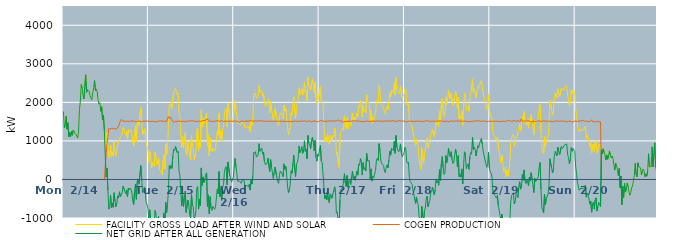
| Category | FACILITY GROSS LOAD AFTER WIND AND SOLAR | COGEN PRODUCTION | NET GRID AFTER ALL GENERATION |
|---|---|---|---|
|  Mon  2/14 | 1763 | 0 | 1763 |
|  Mon  2/14 | 1338 | 0 | 1338 |
|  Mon  2/14 | 1406 | 0 | 1406 |
|  Mon  2/14 | 1637 | 0 | 1637 |
|  Mon  2/14 | 1302 | 0 | 1302 |
|  Mon  2/14 | 1474 | 0 | 1474 |
|  Mon  2/14 | 1107 | 0 | 1107 |
|  Mon  2/14 | 1228 | 0 | 1228 |
|  Mon  2/14 | 1108 | 0 | 1108 |
|  Mon  2/14 | 1243 | 0 | 1243 |
|  Mon  2/14 | 1146 | 0 | 1146 |
|  Mon  2/14 | 1281 | 0 | 1281 |
|  Mon  2/14 | 1255 | 0 | 1255 |
|  Mon  2/14 | 1197 | 0 | 1197 |
|  Mon  2/14 | 1165 | 0 | 1165 |
|  Mon  2/14 | 1125 | 0 | 1125 |
|  Mon  2/14 | 1075 | 0 | 1075 |
|  Mon  2/14 | 1249 | 0 | 1249 |
|  Mon  2/14 | 1811 | 0 | 1811 |
|  Mon  2/14 | 2023 | 0 | 2023 |
|  Mon  2/14 | 2462 | 0 | 2462 |
|  Mon  2/14 | 2377 | 0 | 2377 |
|  Mon  2/14 | 2184 | 0 | 2184 |
|  Mon  2/14 | 2088 | 0 | 2088 |
|  Mon  2/14 | 2095 | 0 | 2095 |
|  Mon  2/14 | 2714 | 0 | 2714 |
|  Mon  2/14 | 2259 | 0 | 2259 |
|  Mon  2/14 | 2332 | 0 | 2332 |
|  Mon  2/14 | 2338 | 0 | 2338 |
|  Mon  2/14 | 2280 | 0 | 2280 |
|  Mon  2/14 | 2171 | 0 | 2171 |
|  Mon  2/14 | 2099 | 0 | 2099 |
|  Mon  2/14 | 2066 | 0 | 2066 |
|  Mon  2/14 | 2262 | 0 | 2262 |
|  Mon  2/14 | 2381 | 0 | 2381 |
|  Mon  2/14 | 2566 | 0 | 2566 |
|  Mon  2/14 | 2305 | 0 | 2305 |
|  Mon  2/14 | 2348 | 0 | 2348 |
|  Mon  2/14 | 2267 | 0 | 2267 |
|  Mon  2/14 | 2052 | 0 | 2052 |
|  Mon  2/14 | 1951 | 0 | 1951 |
|  Mon  2/14 | 1992 | 0 | 1992 |
|  Mon  2/14 | 1769 | 0 | 1769 |
|  Mon  2/14 | 1887 | 0 | 1887 |
|  Mon  2/14 | 1541 | 0 | 1541 |
|  Mon  2/14 | 1666 | 0 | 1666 |
|  Mon  2/14 | 1268 | 0 | 1268 |
|  Mon  2/14 | 1276 | 0 | 1276 |
|  Mon  2/14 | 760 | 699 | 61 |
|  Mon  2/14 | 1222 | 924 | 298 |
|  Mon  2/14 | 830 | 1115 | -285 |
|  Mon  2/14 | 562 | 1330 | -768 |
|  Mon  2/14 | 590 | 1304 | -714 |
|  Mon  2/14 | 893 | 1303 | -410 |
|  Mon  2/14 | 589 | 1323 | -734 |
|  Mon  2/14 | 719 | 1329 | -610 |
|  Mon  2/14 | 599 | 1322 | -723 |
|  Mon  2/14 | 973 | 1318 | -345 |
|  Mon  2/14 | 742 | 1306 | -564 |
|  Mon  2/14 | 605 | 1312 | -707 |
|  Mon  2/14 | 693 | 1317 | -624 |
|  Mon  2/14 | 886 | 1311 | -425 |
|  Mon  2/14 | 901 | 1383 | -482 |
|  Mon  2/14 | 1050 | 1369 | -319 |
|  Mon  2/14 | 1058 | 1511 | -453 |
|  Mon  2/14 | 1131 | 1562 | -431 |
|  Mon  2/14 | 1179 | 1530 | -351 |
|  Mon  2/14 | 1350 | 1523 | -173 |
|  Mon  2/14 | 1318 | 1508 | -190 |
|  Mon  2/14 | 1205 | 1507 | -302 |
|  Mon  2/14 | 1144 | 1511 | -367 |
|  Mon  2/14 | 1241 | 1514 | -273 |
|  Mon  2/14 | 1062 | 1509 | -447 |
|  Mon  2/14 | 1291 | 1515 | -224 |
|  Mon  2/14 | 1236 | 1505 | -269 |
|  Mon  2/14 | 1295 | 1515 | -220 |
|  Mon  2/14 | 1266 | 1516 | -250 |
|  Mon  2/14 | 1169 | 1522 | -353 |
|  Mon  2/14 | 951 | 1521 | -570 |
|  Mon  2/14 | 870 | 1520 | -650 |
|  Mon  2/14 | 1213 | 1506 | -293 |
|  Mon  2/14 | 1394 | 1511 | -117 |
|  Mon  2/14 | 983 | 1498 | -515 |
|  Mon  2/14 | 1468 | 1512 | -44 |
|  Mon  2/14 | 1535 | 1519 | 16 |
|  Mon  2/14 | 1390 | 1515 | -125 |
|  Mon  2/14 | 1399 | 1504 | -105 |
|  Mon  2/14 | 1867 | 1509 | 358 |
|  Mon  2/14 | 1522 | 1506 | 16 |
|  Mon  2/14 | 1164 | 1512 | -348 |
|  Mon  2/14 | 1219 | 1512 | -293 |
|  Mon  2/14 | 1312 | 1507 | -195 |
|  Mon  2/14 | 1182 | 1512 | -330 |
|  Mon  2/14 | 930 | 1502 | -572 |
|  Mon  2/14 | 922 | 1518 | -596 |
|  Mon  2/14 | 775 | 1513 | -738 |
|  Tue  2/15 | 442 | 1506 | -1064 |
|  Tue  2/15 | 728 | 1514 | -786 |
|  Tue  2/15 | 695 | 1506 | -811 |
|  Tue  2/15 | 291 | 1521 | -1230 |
|  Tue  2/15 | 448 | 1508 | -1060 |
|  Tue  2/15 | 394 | 1524 | -1130 |
|  Tue  2/15 | 332 | 1505 | -1173 |
|  Tue  2/15 | 697 | 1504 | -807 |
|  Tue  2/15 | 578 | 1490 | -912 |
|  Tue  2/15 | 375 | 1509 | -1134 |
|  Tue  2/15 | 367 | 1509 | -1142 |
|  Tue  2/15 | 549 | 1511 | -962 |
|  Tue  2/15 | 268 | 1518 | -1250 |
|  Tue  2/15 | 214 | 1509 | -1295 |
|  Tue  2/15 | 184 | 1519 | -1335 |
|  Tue  2/15 | 125 | 1517 | -1392 |
|  Tue  2/15 | 459 | 1509 | -1050 |
|  Tue  2/15 | 639 | 1507 | -868 |
|  Tue  2/15 | 269 | 1506 | -1237 |
|  Tue  2/15 | 928 | 1519 | -591 |
|  Tue  2/15 | 637 | 1505 | -868 |
|  Tue  2/15 | 857 | 1507 | -650 |
|  Tue  2/15 | 1317 | 1635 | -318 |
|  Tue  2/15 | 1940 | 1583 | 357 |
|  Tue  2/15 | 1901 | 1621 | 280 |
|  Tue  2/15 | 1958 | 1593 | 365 |
|  Tue  2/15 | 1837 | 1549 | 288 |
|  Tue  2/15 | 2127 | 1516 | 611 |
|  Tue  2/15 | 2269 | 1485 | 784 |
|  Tue  2/15 | 2257 | 1504 | 753 |
|  Tue  2/15 | 2364 | 1508 | 856 |
|  Tue  2/15 | 2368 | 1512 | 856 |
|  Tue  2/15 | 2199 | 1502 | 697 |
|  Tue  2/15 | 2239 | 1512 | 727 |
|  Tue  2/15 | 1739 | 1524 | 215 |
|  Tue  2/15 | 1624 | 1517 | 107 |
|  Tue  2/15 | 1165 | 1502 | -337 |
|  Tue  2/15 | 829 | 1513 | -684 |
|  Tue  2/15 | 1118 | 1513 | -395 |
|  Tue  2/15 | 824 | 1529 | -705 |
|  Tue  2/15 | 1033 | 1499 | -466 |
|  Tue  2/15 | 1214 | 1517 | -303 |
|  Tue  2/15 | 657 | 1513 | -856 |
|  Tue  2/15 | 625 | 1505 | -880 |
|  Tue  2/15 | 971 | 1508 | -537 |
|  Tue  2/15 | 854 | 1502 | -648 |
|  Tue  2/15 | 587 | 1515 | -928 |
|  Tue  2/15 | 504 | 1505 | -1001 |
|  Tue  2/15 | 1133 | 1525 | -392 |
|  Tue  2/15 | 859 | 1526 | -667 |
|  Tue  2/15 | 803 | 1520 | -717 |
|  Tue  2/15 | 513 | 1519 | -1006 |
|  Tue  2/15 | 538 | 1508 | -970 |
|  Tue  2/15 | 696 | 1510 | -814 |
|  Tue  2/15 | 1278 | 1501 | -223 |
|  Tue  2/15 | 1329 | 1511 | -182 |
|  Tue  2/15 | 749 | 1517 | -768 |
|  Tue  2/15 | 1004 | 1511 | -507 |
|  Tue  2/15 | 821 | 1503 | -682 |
|  Tue  2/15 | 1811 | 1512 | 299 |
|  Tue  2/15 | 1361 | 1518 | -157 |
|  Tue  2/15 | 1579 | 1513 | 66 |
|  Tue  2/15 | 1447 | 1527 | -80 |
|  Tue  2/15 | 1539 | 1528 | 11 |
|  Tue  2/15 | 1661 | 1538 | 123 |
|  Tue  2/15 | 1724 | 1554 | 170 |
|  Tue  2/15 | 871 | 1573 | -702 |
|  Tue  2/15 | 1167 | 1566 | -399 |
|  Tue  2/15 | 610 | 1505 | -895 |
|  Tue  2/15 | 1081 | 1528 | -447 |
|  Tue  2/15 | 756 | 1508 | -752 |
|  Tue  2/15 | 713 | 1517 | -804 |
|  Tue  2/15 | 812 | 1508 | -696 |
|  Tue  2/15 | 766 | 1505 | -739 |
|  Tue  2/15 | 731 | 1507 | -776 |
|  Tue  2/15 | 795 | 1514 | -719 |
|  Tue  2/15 | 792 | 1526 | -734 |
|  Tue  2/15 | 1253 | 1506 | -253 |
|  Tue  2/15 | 1149 | 1520 | -371 |
|  Tue  2/15 | 1713 | 1511 | 202 |
|  Tue  2/15 | 1055 | 1503 | -448 |
|  Tue  2/15 | 1262 | 1502 | -240 |
|  Tue  2/15 | 987 | 1529 | -542 |
|  Tue  2/15 | 1306 | 1505 | -199 |
|  Tue  2/15 | 1366 | 1504 | -138 |
|  Tue  2/15 | 1690 | 1508 | 182 |
|  Tue  2/15 | 1818 | 1515 | 303 |
|  Tue  2/15 | 1847 | 1514 | 333 |
|  Tue  2/15 | 1370 | 1512 | -142 |
|  Tue  2/15 | 1976 | 1522 | 454 |
|  Tue  2/15 | 1962 | 1504 | 458 |
|  Tue  2/15 | 1605 | 1509 | 96 |
|  Tue  2/15 | 1561 | 1518 | 43 |
|  Tue  2/15 | 1447 | 1518 | -71 |
|  Tue  2/15 | 1422 | 1504 | -82 |
|  Tue  2/15 | 1568 | 1509 | 59 |
|  Wed  2/16 | 1572 | 1519 | 53 |
|  Wed  2/16 | 2056 | 1511 | 545 |
|  Wed  2/16 | 1830 | 1507 | 323 |
|  Wed  2/16 | 1665 | 1509 | 156 |
|  Wed  2/16 | 1462 | 1508 | -46 |
|  Wed  2/16 | 1466 | 1512 | -46 |
|  Wed  2/16 | 1438 | 1478 | -40 |
|  Wed  2/16 | 1456 | 1506 | -50 |
|  Wed  2/16 | 1420 | 1521 | -101 |
|  Wed  2/16 | 1498 | 1512 | -14 |
|  Wed  2/16 | 1513 | 1503 | 10 |
|  Wed  2/16 | 1504 | 1503 | 1 |
|  Wed  2/16 | 1327 | 1521 | -194 |
|  Wed  2/16 | 1314 | 1504 | -190 |
|  Wed  2/16 | 1386 | 1539 | -153 |
|  Wed  2/16 | 1356 | 1503 | -147 |
|  Wed  2/16 | 1323 | 1515 | -192 |
|  Wed  2/16 | 1390 | 1515 | -125 |
|  Wed  2/16 | 1230 | 1506 | -276 |
|  Wed  2/16 | 1518 | 1524 | -6 |
|  Wed  2/16 | 1398 | 1518 | -120 |
|  Wed  2/16 | 1612 | 1511 | 101 |
|  Wed  2/16 | 2213 | 1511 | 702 |
|  Wed  2/16 | 2190 | 1517 | 673 |
|  Wed  2/16 | 2235 | 1514 | 721 |
|  Wed  2/16 | 2098 | 1519 | 579 |
|  Wed  2/16 | 2121 | 1527 | 594 |
|  Wed  2/16 | 2141 | 1512 | 629 |
|  Wed  2/16 | 2443 | 1516 | 927 |
|  Wed  2/16 | 2260 | 1530 | 730 |
|  Wed  2/16 | 2280 | 1508 | 772 |
|  Wed  2/16 | 2326 | 1509 | 817 |
|  Wed  2/16 | 2163 | 1511 | 652 |
|  Wed  2/16 | 2221 | 1515 | 706 |
|  Wed  2/16 | 1985 | 1520 | 465 |
|  Wed  2/16 | 1902 | 1516 | 386 |
|  Wed  2/16 | 1879 | 1510 | 369 |
|  Wed  2/16 | 1912 | 1502 | 410 |
|  Wed  2/16 | 2061 | 1508 | 553 |
|  Wed  2/16 | 2087 | 1514 | 573 |
|  Wed  2/16 | 1728 | 1519 | 209 |
|  Wed  2/16 | 2023 | 1507 | 516 |
|  Wed  2/16 | 1825 | 1514 | 311 |
|  Wed  2/16 | 1700 | 1514 | 186 |
|  Wed  2/16 | 1523 | 1495 | 28 |
|  Wed  2/16 | 1698 | 1512 | 186 |
|  Wed  2/16 | 1842 | 1519 | 323 |
|  Wed  2/16 | 1850 | 1507 | 343 |
|  Wed  2/16 | 1563 | 1511 | 52 |
|  Wed  2/16 | 1461 | 1514 | -53 |
|  Wed  2/16 | 1409 | 1509 | -100 |
|  Wed  2/16 | 1638 | 1508 | 130 |
|  Wed  2/16 | 1731 | 1513 | 218 |
|  Wed  2/16 | 1700 | 1510 | 190 |
|  Wed  2/16 | 1648 | 1509 | 139 |
|  Wed  2/16 | 1581 | 1511 | 70 |
|  Wed  2/16 | 1927 | 1523 | 404 |
|  Wed  2/16 | 1775 | 1509 | 266 |
|  Wed  2/16 | 1845 | 1503 | 342 |
|  Wed  2/16 | 1643 | 1502 | 141 |
|  Wed  2/16 | 1342 | 1512 | -170 |
|  Wed  2/16 | 1166 | 1511 | -345 |
|  Wed  2/16 | 1239 | 1513 | -274 |
|  Wed  2/16 | 1348 | 1500 | -152 |
|  Wed  2/16 | 1726 | 1504 | 222 |
|  Wed  2/16 | 1663 | 1502 | 161 |
|  Wed  2/16 | 1910 | 1512 | 398 |
|  Wed  2/16 | 2144 | 1512 | 632 |
|  Wed  2/16 | 1768 | 1512 | 256 |
|  Wed  2/16 | 1585 | 1513 | 72 |
|  Wed  2/16 | 1912 | 1516 | 396 |
|  Wed  2/16 | 1942 | 1508 | 434 |
|  Wed  2/16 | 2070 | 1517 | 553 |
|  Wed  2/16 | 2379 | 1510 | 869 |
|  Wed  2/16 | 2209 | 1517 | 692 |
|  Wed  2/16 | 2273 | 1511 | 762 |
|  Wed  2/16 | 2357 | 1508 | 849 |
|  Wed  2/16 | 2191 | 1511 | 680 |
|  Wed  2/16 | 2245 | 1507 | 738 |
|  Wed  2/16 | 2527 | 1524 | 1003 |
|  Wed  2/16 | 2255 | 1525 | 730 |
|  Wed  2/16 | 2295 | 1505 | 790 |
|  Wed  2/16 | 2040 | 1507 | 533 |
|  Wed  2/16 | 2654 | 1514 | 1140 |
|  Wed  2/16 | 2450 | 1509 | 941 |
|  Wed  2/16 | 2411 | 1516 | 895 |
|  Wed  2/16 | 2314 | 1514 | 800 |
|  Wed  2/16 | 2510 | 1493 | 1017 |
|  Wed  2/16 | 2610 | 1509 | 1101 |
|  Wed  2/16 | 2471 | 1515 | 956 |
|  Wed  2/16 | 2255 | 1511 | 744 |
|  Wed  2/16 | 2526 | 1513 | 1013 |
|  Wed  2/16 | 2097 | 1520 | 577 |
|  Wed  2/16 | 1972 | 1499 | 473 |
|  Wed  2/16 | 2166 | 1514 | 652 |
|  Wed  2/16 | 2107 | 1504 | 603 |
|  Thu  2/17 | 2292 | 1502 | 790 |
|  Thu  2/17 | 2416 | 1532 | 884 |
|  Thu  2/17 | 1982 | 1507 | 475 |
|  Thu  2/17 | 1960 | 1526 | 434 |
|  Thu  2/17 | 1974 | 1519 | 455 |
|  Thu  2/17 | 1295 | 1499 | -204 |
|  Thu  2/17 | 1005 | 1510 | -505 |
|  Thu  2/17 | 1104 | 1514 | -410 |
|  Thu  2/17 | 974 | 1506 | -532 |
|  Thu  2/17 | 1175 | 1512 | -337 |
|  Thu  2/17 | 994 | 1528 | -534 |
|  Thu  2/17 | 913 | 1515 | -602 |
|  Thu  2/17 | 1154 | 1527 | -373 |
|  Thu  2/17 | 1109 | 1516 | -407 |
|  Thu  2/17 | 1030 | 1518 | -488 |
|  Thu  2/17 | 1144 | 1521 | -377 |
|  Thu  2/17 | 1100 | 1501 | -401 |
|  Thu  2/17 | 1326 | 1516 | -190 |
|  Thu  2/17 | 1167 | 1527 | -360 |
|  Thu  2/17 | 643 | 1517 | -874 |
|  Thu  2/17 | 700 | 1542 | -842 |
|  Thu  2/17 | 431 | 1546 | -1115 |
|  Thu  2/17 | 316 | 1534 | -1218 |
|  Thu  2/17 | 985 | 1511 | -526 |
|  Thu  2/17 | 1250 | 1516 | -266 |
|  Thu  2/17 | 1260 | 1518 | -258 |
|  Thu  2/17 | 1324 | 1522 | -198 |
|  Thu  2/17 | 1273 | 1485 | -212 |
|  Thu  2/17 | 1651 | 1501 | 150 |
|  Thu  2/17 | 1419 | 1511 | -92 |
|  Thu  2/17 | 1323 | 1509 | -186 |
|  Thu  2/17 | 1605 | 1502 | 103 |
|  Thu  2/17 | 1312 | 1518 | -206 |
|  Thu  2/17 | 1469 | 1516 | -47 |
|  Thu  2/17 | 1513 | 1505 | 8 |
|  Thu  2/17 | 1378 | 1510 | -132 |
|  Thu  2/17 | 1569 | 1499 | 70 |
|  Thu  2/17 | 1730 | 1512 | 218 |
|  Thu  2/17 | 1533 | 1516 | 17 |
|  Thu  2/17 | 1610 | 1530 | 80 |
|  Thu  2/17 | 1510 | 1535 | -25 |
|  Thu  2/17 | 1609 | 1511 | 98 |
|  Thu  2/17 | 1718 | 1505 | 213 |
|  Thu  2/17 | 1633 | 1521 | 112 |
|  Thu  2/17 | 1914 | 1519 | 395 |
|  Thu  2/17 | 1872 | 1504 | 368 |
|  Thu  2/17 | 2051 | 1507 | 544 |
|  Thu  2/17 | 1970 | 1510 | 460 |
|  Thu  2/17 | 1619 | 1504 | 115 |
|  Thu  2/17 | 1932 | 1497 | 435 |
|  Thu  2/17 | 1764 | 1500 | 264 |
|  Thu  2/17 | 1794 | 1501 | 293 |
|  Thu  2/17 | 1723 | 1505 | 218 |
|  Thu  2/17 | 2197 | 1518 | 679 |
|  Thu  2/17 | 1987 | 1503 | 484 |
|  Thu  2/17 | 1988 | 1509 | 479 |
|  Thu  2/17 | 2006 | 1520 | 486 |
|  Thu  2/17 | 1504 | 1493 | 11 |
|  Thu  2/17 | 1801 | 1526 | 275 |
|  Thu  2/17 | 1452 | 1495 | -43 |
|  Thu  2/17 | 1609 | 1527 | 82 |
|  Thu  2/17 | 1556 | 1509 | 47 |
|  Thu  2/17 | 1660 | 1505 | 155 |
|  Thu  2/17 | 1741 | 1507 | 234 |
|  Thu  2/17 | 2021 | 1519 | 502 |
|  Thu  2/17 | 2051 | 1506 | 545 |
|  Thu  2/17 | 2006 | 1513 | 493 |
|  Thu  2/17 | 2450 | 1522 | 928 |
|  Thu  2/17 | 2254 | 1515 | 739 |
|  Thu  2/17 | 1980 | 1502 | 478 |
|  Thu  2/17 | 1920 | 1506 | 414 |
|  Thu  2/17 | 1895 | 1492 | 403 |
|  Thu  2/17 | 1878 | 1516 | 362 |
|  Thu  2/17 | 1737 | 1517 | 220 |
|  Thu  2/17 | 1692 | 1515 | 177 |
|  Thu  2/17 | 1833 | 1512 | 321 |
|  Thu  2/17 | 1895 | 1514 | 381 |
|  Thu  2/17 | 1808 | 1507 | 301 |
|  Thu  2/17 | 2026 | 1517 | 509 |
|  Thu  2/17 | 2236 | 1507 | 729 |
|  Thu  2/17 | 2144 | 1514 | 630 |
|  Thu  2/17 | 2321 | 1519 | 802 |
|  Thu  2/17 | 2305 | 1522 | 783 |
|  Thu  2/17 | 2252 | 1502 | 750 |
|  Thu  2/17 | 2507 | 1518 | 989 |
|  Thu  2/17 | 2191 | 1512 | 679 |
|  Thu  2/17 | 2642 | 1501 | 1141 |
|  Thu  2/17 | 2344 | 1514 | 830 |
|  Thu  2/17 | 2280 | 1518 | 762 |
|  Thu  2/17 | 2217 | 1498 | 719 |
|  Thu  2/17 | 2288 | 1527 | 761 |
|  Thu  2/17 | 2423 | 1504 | 919 |
|  Thu  2/17 | 2202 | 1509 | 693 |
|  Thu  2/17 | 2111 | 1522 | 589 |
|  Thu  2/17 | 2098 | 1516 | 582 |
|  Thu  2/17 | 2203 | 1511 | 692 |
|  Fri  2/18 | 2350 | 1511 | 839 |
|  Fri  2/18 | 2306 | 1512 | 794 |
|  Fri  2/18 | 1957 | 1489 | 468 |
|  Fri  2/18 | 1929 | 1511 | 418 |
|  Fri  2/18 | 1966 | 1513 | 453 |
|  Fri  2/18 | 1545 | 1492 | 53 |
|  Fri  2/18 | 1450 | 1512 | -62 |
|  Fri  2/18 | 1434 | 1518 | -84 |
|  Fri  2/18 | 1384 | 1509 | -125 |
|  Fri  2/18 | 1231 | 1506 | -275 |
|  Fri  2/18 | 1138 | 1507 | -369 |
|  Fri  2/18 | 1011 | 1517 | -506 |
|  Fri  2/18 | 886 | 1507 | -621 |
|  Fri  2/18 | 1043 | 1497 | -454 |
|  Fri  2/18 | 917 | 1516 | -599 |
|  Fri  2/18 | 868 | 1519 | -651 |
|  Fri  2/18 | 533 | 1506 | -973 |
|  Fri  2/18 | 349 | 1519 | -1170 |
|  Fri  2/18 | 260 | 1518 | -1258 |
|  Fri  2/18 | 819 | 1519 | -700 |
|  Fri  2/18 | 538 | 1500 | -962 |
|  Fri  2/18 | 413 | 1513 | -1100 |
|  Fri  2/18 | 706 | 1512 | -806 |
|  Fri  2/18 | 772 | 1513 | -741 |
|  Fri  2/18 | 1014 | 1518 | -504 |
|  Fri  2/18 | 1070 | 1505 | -435 |
|  Fri  2/18 | 817 | 1523 | -706 |
|  Fri  2/18 | 902 | 1526 | -624 |
|  Fri  2/18 | 955 | 1503 | -548 |
|  Fri  2/18 | 1165 | 1512 | -347 |
|  Fri  2/18 | 1212 | 1512 | -300 |
|  Fri  2/18 | 1306 | 1501 | -195 |
|  Fri  2/18 | 1191 | 1508 | -317 |
|  Fri  2/18 | 1102 | 1506 | -404 |
|  Fri  2/18 | 1243 | 1511 | -268 |
|  Fri  2/18 | 1519 | 1516 | 3 |
|  Fri  2/18 | 1423 | 1511 | -88 |
|  Fri  2/18 | 1474 | 1505 | -31 |
|  Fri  2/18 | 1365 | 1517 | -152 |
|  Fri  2/18 | 1772 | 1516 | 256 |
|  Fri  2/18 | 1495 | 1521 | -26 |
|  Fri  2/18 | 1927 | 1512 | 415 |
|  Fri  2/18 | 2107 | 1512 | 595 |
|  Fri  2/18 | 1825 | 1517 | 308 |
|  Fri  2/18 | 1632 | 1505 | 127 |
|  Fri  2/18 | 1671 | 1508 | 163 |
|  Fri  2/18 | 2131 | 1509 | 622 |
|  Fri  2/18 | 1943 | 1507 | 436 |
|  Fri  2/18 | 2059 | 1511 | 548 |
|  Fri  2/18 | 2315 | 1505 | 810 |
|  Fri  2/18 | 2140 | 1496 | 644 |
|  Fri  2/18 | 2091 | 1501 | 590 |
|  Fri  2/18 | 2246 | 1525 | 721 |
|  Fri  2/18 | 2020 | 1505 | 515 |
|  Fri  2/18 | 1925 | 1510 | 415 |
|  Fri  2/18 | 1950 | 1500 | 450 |
|  Fri  2/18 | 2145 | 1514 | 631 |
|  Fri  2/18 | 2293 | 1508 | 785 |
|  Fri  2/18 | 2154 | 1519 | 635 |
|  Fri  2/18 | 1843 | 1511 | 332 |
|  Fri  2/18 | 2131 | 1513 | 618 |
|  Fri  2/18 | 1580 | 1507 | 73 |
|  Fri  2/18 | 1639 | 1512 | 127 |
|  Fri  2/18 | 1571 | 1511 | 60 |
|  Fri  2/18 | 1787 | 1513 | 274 |
|  Fri  2/18 | 1400 | 1514 | -114 |
|  Fri  2/18 | 1867 | 1508 | 359 |
|  Fri  2/18 | 2239 | 1521 | 718 |
|  Fri  2/18 | 2182 | 1522 | 660 |
|  Fri  2/18 | 1783 | 1499 | 284 |
|  Fri  2/18 | 1854 | 1490 | 364 |
|  Fri  2/18 | 1905 | 1502 | 403 |
|  Fri  2/18 | 1769 | 1507 | 262 |
|  Fri  2/18 | 2102 | 1516 | 586 |
|  Fri  2/18 | 2198 | 1503 | 695 |
|  Fri  2/18 | 2174 | 1517 | 657 |
|  Fri  2/18 | 2604 | 1509 | 1095 |
|  Fri  2/18 | 2252 | 1485 | 767 |
|  Fri  2/18 | 2343 | 1512 | 831 |
|  Fri  2/18 | 2289 | 1511 | 778 |
|  Fri  2/18 | 2127 | 1518 | 609 |
|  Fri  2/18 | 2255 | 1512 | 743 |
|  Fri  2/18 | 2402 | 1524 | 878 |
|  Fri  2/18 | 2362 | 1535 | 827 |
|  Fri  2/18 | 2455 | 1516 | 939 |
|  Fri  2/18 | 2443 | 1519 | 924 |
|  Fri  2/18 | 2568 | 1505 | 1063 |
|  Fri  2/18 | 2418 | 1504 | 914 |
|  Fri  2/18 | 2253 | 1517 | 736 |
|  Fri  2/18 | 2139 | 1513 | 626 |
|  Fri  2/18 | 2120 | 1518 | 602 |
|  Fri  2/18 | 1922 | 1504 | 418 |
|  Fri  2/18 | 1813 | 1498 | 315 |
|  Fri  2/18 | 1876 | 1508 | 368 |
|  Fri  2/18 | 2212 | 1509 | 703 |
|  Fri  2/18 | 1799 | 1504 | 295 |
|  Sat  2/19 | 1700 | 1507 | 193 |
|  Sat  2/19 | 1682 | 1521 | 161 |
|  Sat  2/19 | 1569 | 1514 | 55 |
|  Sat  2/19 | 1199 | 1509 | -310 |
|  Sat  2/19 | 1175 | 1506 | -331 |
|  Sat  2/19 | 1087 | 1507 | -420 |
|  Sat  2/19 | 1088 | 1510 | -422 |
|  Sat  2/19 | 1016 | 1502 | -486 |
|  Sat  2/19 | 1097 | 1510 | -413 |
|  Sat  2/19 | 867 | 1531 | -664 |
|  Sat  2/19 | 709 | 1505 | -796 |
|  Sat  2/19 | 579 | 1513 | -934 |
|  Sat  2/19 | 435 | 1503 | -1068 |
|  Sat  2/19 | 628 | 1525 | -897 |
|  Sat  2/19 | 495 | 1512 | -1017 |
|  Sat  2/19 | 189 | 1497 | -1308 |
|  Sat  2/19 | 230 | 1509 | -1279 |
|  Sat  2/19 | 319 | 1511 | -1192 |
|  Sat  2/19 | 76 | 1500 | -1424 |
|  Sat  2/19 | 246 | 1511 | -1265 |
|  Sat  2/19 | 97 | 1541 | -1444 |
|  Sat  2/19 | 248 | 1519 | -1271 |
|  Sat  2/19 | 472 | 1521 | -1049 |
|  Sat  2/19 | 921 | 1503 | -582 |
|  Sat  2/19 | 1087 | 1506 | -419 |
|  Sat  2/19 | 1138 | 1519 | -381 |
|  Sat  2/19 | 1175 | 1523 | -348 |
|  Sat  2/19 | 865 | 1501 | -636 |
|  Sat  2/19 | 957 | 1521 | -564 |
|  Sat  2/19 | 1131 | 1514 | -383 |
|  Sat  2/19 | 1092 | 1506 | -414 |
|  Sat  2/19 | 1068 | 1535 | -467 |
|  Sat  2/19 | 1296 | 1503 | -207 |
|  Sat  2/19 | 1447 | 1506 | -59 |
|  Sat  2/19 | 1257 | 1510 | -253 |
|  Sat  2/19 | 1353 | 1570 | -217 |
|  Sat  2/19 | 1638 | 1511 | 127 |
|  Sat  2/19 | 1483 | 1505 | -22 |
|  Sat  2/19 | 1759 | 1513 | 246 |
|  Sat  2/19 | 1486 | 1513 | -27 |
|  Sat  2/19 | 1412 | 1514 | -102 |
|  Sat  2/19 | 1514 | 1512 | 2 |
|  Sat  2/19 | 1455 | 1520 | -65 |
|  Sat  2/19 | 1338 | 1506 | -168 |
|  Sat  2/19 | 1586 | 1523 | 63 |
|  Sat  2/19 | 1460 | 1492 | -32 |
|  Sat  2/19 | 1682 | 1508 | 174 |
|  Sat  2/19 | 1499 | 1490 | 9 |
|  Sat  2/19 | 1390 | 1524 | -134 |
|  Sat  2/19 | 1163 | 1504 | -341 |
|  Sat  2/19 | 1525 | 1497 | 28 |
|  Sat  2/19 | 1459 | 1521 | -62 |
|  Sat  2/19 | 1471 | 1508 | -37 |
|  Sat  2/19 | 1534 | 1501 | 33 |
|  Sat  2/19 | 1587 | 1517 | 70 |
|  Sat  2/19 | 1835 | 1511 | 324 |
|  Sat  2/19 | 1952 | 1512 | 440 |
|  Sat  2/19 | 1246 | 1504 | -258 |
|  Sat  2/19 | 767 | 1505 | -738 |
|  Sat  2/19 | 791 | 1508 | -717 |
|  Sat  2/19 | 660 | 1526 | -866 |
|  Sat  2/19 | 1127 | 1505 | -378 |
|  Sat  2/19 | 851 | 1513 | -662 |
|  Sat  2/19 | 1013 | 1504 | -491 |
|  Sat  2/19 | 1008 | 1510 | -502 |
|  Sat  2/19 | 1142 | 1519 | -377 |
|  Sat  2/19 | 1353 | 1510 | -157 |
|  Sat  2/19 | 2049 | 1512 | 537 |
|  Sat  2/19 | 2070 | 1513 | 557 |
|  Sat  2/19 | 1799 | 1506 | 293 |
|  Sat  2/19 | 1669 | 1502 | 167 |
|  Sat  2/19 | 1779 | 1508 | 271 |
|  Sat  2/19 | 2097 | 1508 | 589 |
|  Sat  2/19 | 2244 | 1513 | 731 |
|  Sat  2/19 | 2236 | 1522 | 714 |
|  Sat  2/19 | 2111 | 1498 | 613 |
|  Sat  2/19 | 2349 | 1512 | 837 |
|  Sat  2/19 | 2245 | 1513 | 732 |
|  Sat  2/19 | 2151 | 1508 | 643 |
|  Sat  2/19 | 2138 | 1513 | 625 |
|  Sat  2/19 | 2366 | 1516 | 850 |
|  Sat  2/19 | 2327 | 1521 | 806 |
|  Sat  2/19 | 2352 | 1513 | 839 |
|  Sat  2/19 | 2336 | 1504 | 832 |
|  Sat  2/19 | 2419 | 1512 | 907 |
|  Sat  2/19 | 2421 | 1512 | 909 |
|  Sat  2/19 | 2415 | 1497 | 918 |
|  Sat  2/19 | 2164 | 1517 | 647 |
|  Sat  2/19 | 2075 | 1507 | 568 |
|  Sat  2/19 | 1915 | 1508 | 407 |
|  Sat  2/19 | 2030 | 1514 | 516 |
|  Sat  2/19 | 2333 | 1509 | 824 |
|  Sat  2/19 | 2215 | 1485 | 730 |
|  Sat  2/19 | 2311 | 1505 | 806 |
|  Sat  2/19 | 2299 | 1505 | 794 |
|  Sat  2/19 | 2237 | 1512 | 725 |
|  Sun  2/20 | 1861 | 1515 | 346 |
|  Sun  2/20 | 1675 | 1518 | 157 |
|  Sun  2/20 | 1430 | 1503 | -73 |
|  Sun  2/20 | 1335 | 1510 | -175 |
|  Sun  2/20 | 1237 | 1518 | -281 |
|  Sun  2/20 | 1241 | 1506 | -265 |
|  Sun  2/20 | 1300 | 1517 | -217 |
|  Sun  2/20 | 1274 | 1524 | -250 |
|  Sun  2/20 | 1296 | 1532 | -236 |
|  Sun  2/20 | 1290 | 1516 | -226 |
|  Sun  2/20 | 1306 | 1505 | -199 |
|  Sun  2/20 | 1382 | 1527 | -145 |
|  Sun  2/20 | 1059 | 1518 | -459 |
|  Sun  2/20 | 1163 | 1518 | -355 |
|  Sun  2/20 | 1092 | 1499 | -407 |
|  Sun  2/20 | 1000 | 1513 | -513 |
|  Sun  2/20 | 862 | 1504 | -642 |
|  Sun  2/20 | 954 | 1517 | -563 |
|  Sun  2/20 | 695 | 1544 | -849 |
|  Sun  2/20 | 873 | 1502 | -629 |
|  Sun  2/20 | 921 | 1508 | -587 |
|  Sun  2/20 | 731 | 1500 | -769 |
|  Sun  2/20 | 976 | 1507 | -531 |
|  Sun  2/20 | 1015 | 1491 | -476 |
|  Sun  2/20 | 683 | 1503 | -820 |
|  Sun  2/20 | 815 | 1518 | -703 |
|  Sun  2/20 | 897 | 1492 | -595 |
|  Sun  2/20 | 925 | 1516 | -591 |
|  Sun  2/20 | 792 | 1497 | -705 |
|  Sun  2/20 | 765 | 0 | 765 |
|  Sun  2/20 | 661 | 0 | 661 |
|  Sun  2/20 | 795 | 0 | 795 |
|  Sun  2/20 | 701 | 0 | 701 |
|  Sun  2/20 | 635 | 0 | 635 |
|  Sun  2/20 | 502 | 0 | 502 |
|  Sun  2/20 | 638 | 0 | 638 |
|  Sun  2/20 | 523 | 0 | 523 |
|  Sun  2/20 | 611 | 0 | 611 |
|  Sun  2/20 | 741 | 0 | 741 |
|  Sun  2/20 | 639 | 0 | 639 |
|  Sun  2/20 | 556 | 0 | 556 |
|  Sun  2/20 | 611 | 0 | 611 |
|  Sun  2/20 | 542 | 0 | 542 |
|  Sun  2/20 | 564 | 0 | 564 |
|  Sun  2/20 | 241 | 0 | 241 |
|  Sun  2/20 | 419 | 0 | 419 |
|  Sun  2/20 | 363 | 0 | 363 |
|  Sun  2/20 | 257 | 0 | 257 |
|  Sun  2/20 | 96 | 0 | 96 |
|  Sun  2/20 | 287 | 0 | 287 |
|  Sun  2/20 | -215 | 0 | -215 |
|  Sun  2/20 | 90 | 0 | 90 |
|  Sun  2/20 | -658 | 0 | -658 |
|  Sun  2/20 | -180 | 0 | -180 |
|  Sun  2/20 | -467 | 0 | -467 |
|  Sun  2/20 | -106 | 0 | -106 |
|  Sun  2/20 | -328 | 0 | -328 |
|  Sun  2/20 | -254 | 0 | -254 |
|  Sun  2/20 | -89 | 0 | -89 |
|  Sun  2/20 | -189 | 0 | -189 |
|  Sun  2/20 | -327 | 0 | -327 |
|  Sun  2/20 | -412 | 0 | -412 |
|  Sun  2/20 | -342 | 0 | -342 |
|  Sun  2/20 | -217 | 0 | -217 |
|  Sun  2/20 | -167 | 0 | -167 |
|  Sun  2/20 | -31 | 0 | -31 |
|  Sun  2/20 | 99 | 0 | 99 |
|  Sun  2/20 | 417 | 0 | 417 |
|  Sun  2/20 | 124 | 0 | 124 |
|  Sun  2/20 | 69 | 0 | 69 |
|  Sun  2/20 | 432 | 0 | 432 |
|  Sun  2/20 | 330 | 0 | 330 |
|  Sun  2/20 | 345 | 0 | 345 |
|  Sun  2/20 | 304 | 0 | 304 |
|  Sun  2/20 | 116 | 0 | 116 |
|  Sun  2/20 | 211 | 0 | 211 |
|  Sun  2/20 | 268 | 0 | 268 |
|  Sun  2/20 | 215 | 0 | 215 |
|  Sun  2/20 | 69 | 0 | 69 |
|  Sun  2/20 | 145 | 0 | 145 |
|  Sun  2/20 | 82 | 0 | 82 |
|  Sun  2/20 | 218 | 0 | 218 |
|  Sun  2/20 | 667 | 0 | 667 |
|  Sun  2/20 | 330 | 0 | 330 |
|  Sun  2/20 | 337 | 0 | 337 |
|  Sun  2/20 | 331 | 0 | 331 |
|  Sun  2/20 | 848 | 0 | 848 |
|  Sun  2/20 | 323 | 0 | 323 |
|  Sun  2/20 | 331 | 0 | 331 |
|  Sun  2/20 | 949 | 0 | 949 |
|  Sun  2/20 | 326 | 0 | 326 |
|  Sun  2/20 | 218 | 0 | 218 |